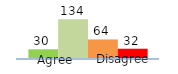
| Category | Series 0 | Series 1 | Series 2 | Series 3 |
|---|---|---|---|---|
| 0 | 30 | 134 | 64 | 32 |